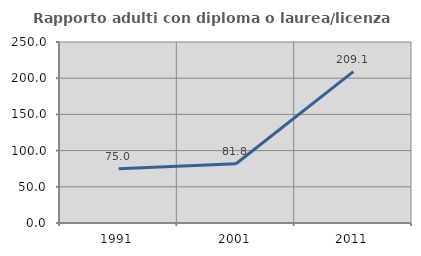
| Category | Rapporto adulti con diploma o laurea/licenza media  |
|---|---|
| 1991.0 | 75 |
| 2001.0 | 81.818 |
| 2011.0 | 209.091 |